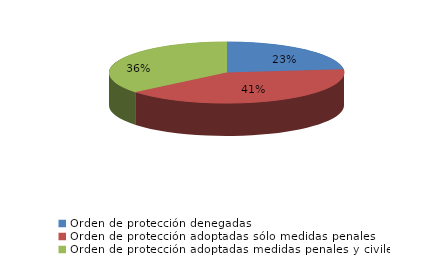
| Category | Series 0 |
|---|---|
| Orden de protección denegadas | 53 |
| Orden de protección adoptadas sólo medidas penales | 93 |
| Orden de protección adoptadas medidas penales y civiles | 82 |